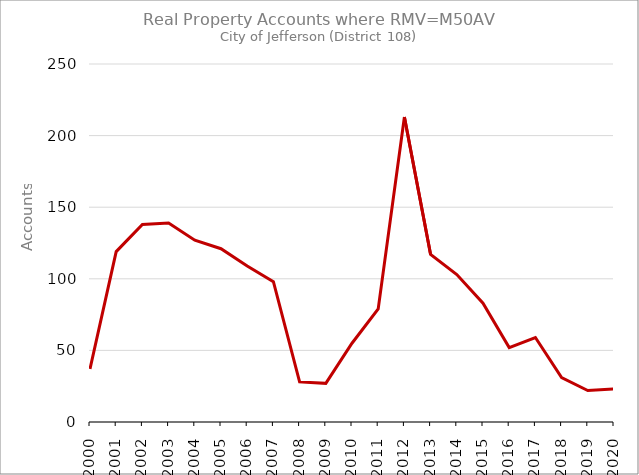
| Category | RMVM50AV |
|---|---|
| 2000.0 | 37 |
| 2001.0 | 119 |
| 2002.0 | 138 |
| 2003.0 | 139 |
| 2004.0 | 127 |
| 2005.0 | 121 |
| 2006.0 | 109 |
| 2007.0 | 98 |
| 2008.0 | 28 |
| 2009.0 | 27 |
| 2010.0 | 55 |
| 2011.0 | 79 |
| 2012.0 | 213 |
| 2013.0 | 117 |
| 2014.0 | 103 |
| 2015.0 | 83 |
| 2016.0 | 52 |
| 2017.0 | 59 |
| 2018.0 | 31 |
| 2019.0 | 22 |
| 2020.0 | 23 |